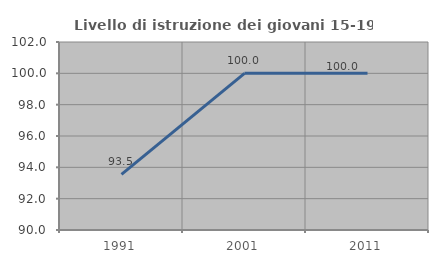
| Category | Livello di istruzione dei giovani 15-19 anni |
|---|---|
| 1991.0 | 93.548 |
| 2001.0 | 100 |
| 2011.0 | 100 |